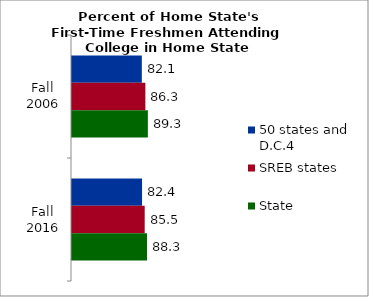
| Category | 50 states and D.C.4 | SREB states | State |
|---|---|---|---|
| Fall 2006 | 82.128 | 86.319 | 89.255 |
| Fall 2016 | 82.407 | 85.524 | 88.262 |